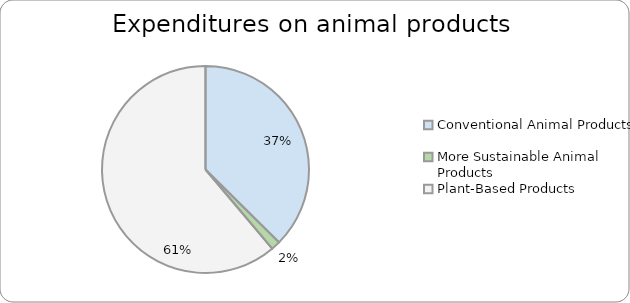
| Category | Series 0 |
|---|---|
| Conventional Animal Products | 0.374 |
| More Sustainable Animal Products | 0.014 |
| Plant-Based Products | 0.611 |